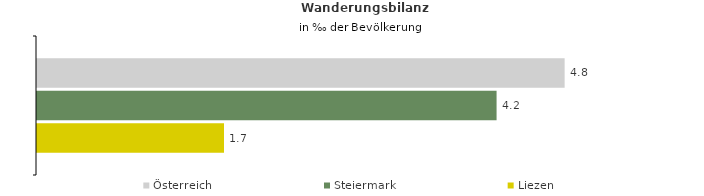
| Category | Österreich | Steiermark | Liezen |
|---|---|---|---|
| Wanderungsrate in ‰ der Bevölkerung, Periode 2017-2021 | 4.789 | 4.172 | 1.697 |